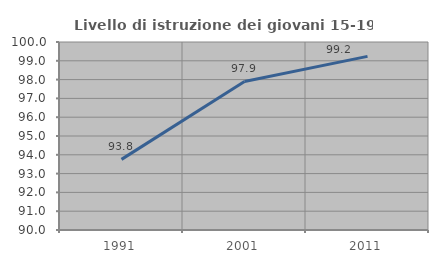
| Category | Livello di istruzione dei giovani 15-19 anni |
|---|---|
| 1991.0 | 93.756 |
| 2001.0 | 97.904 |
| 2011.0 | 99.237 |